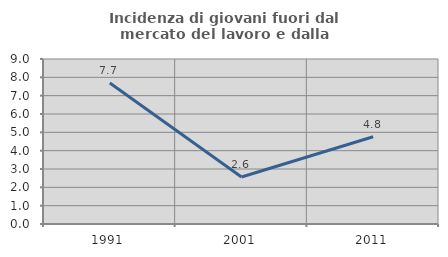
| Category | Incidenza di giovani fuori dal mercato del lavoro e dalla formazione  |
|---|---|
| 1991.0 | 7.692 |
| 2001.0 | 2.564 |
| 2011.0 | 4.762 |